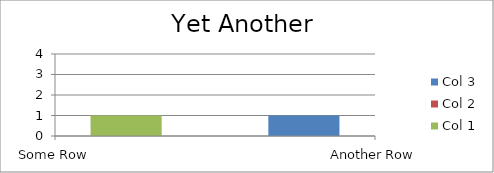
| Category | Col 3 | Col 2 | Col 1 |
|---|---|---|---|
| Some Row | 3 | 0 | 1 |
| Another Row | 1 | 0 | 3 |